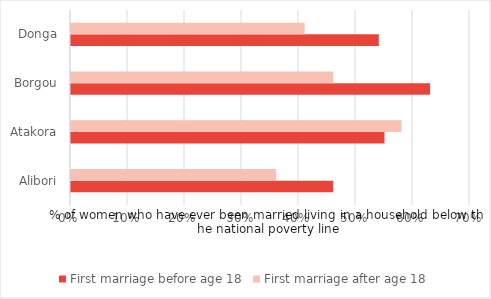
| Category | First marriage before age 18 | First marriage after age 18 |
|---|---|---|
| Alibori | 0.46 | 0.36 |
| Atakora | 0.55 | 0.58 |
| Borgou | 0.63 | 0.46 |
| Donga | 0.54 | 0.41 |